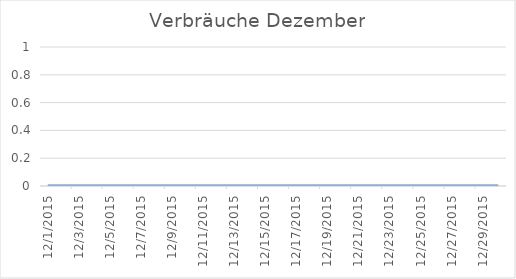
| Category | Series 0 |
|---|---|
| 01/12/2015 | 0 |
| 02/12/2015 | 0 |
| 03/12/2015 | 0 |
| 04/12/2015 | 0 |
| 05/12/2015 | 0 |
| 06/12/2015 | 0 |
| 07/12/2015 | 0 |
| 08/12/2015 | 0 |
| 09/12/2015 | 0 |
| 10/12/2015 | 0 |
| 11/12/2015 | 0 |
| 12/12/2015 | 0 |
| 13/12/2015 | 0 |
| 14/12/2015 | 0 |
| 15/12/2015 | 0 |
| 16/12/2015 | 0 |
| 17/12/2015 | 0 |
| 18/12/2015 | 0 |
| 19/12/2015 | 0 |
| 20/12/2015 | 0 |
| 21/12/2015 | 0 |
| 22/12/2015 | 0 |
| 23/12/2015 | 0 |
| 24/12/2015 | 0 |
| 25/12/2015 | 0 |
| 26/12/2015 | 0 |
| 27/12/2015 | 0 |
| 28/12/2015 | 0 |
| 29/12/2015 | 0 |
| 30/12/2015 | 0 |